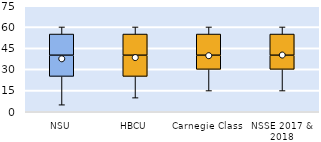
| Category | 25th | 50th | 75th |
|---|---|---|---|
| NSU | 25 | 15 | 15 |
| HBCU | 25 | 15 | 15 |
| Carnegie Class | 30 | 10 | 15 |
| NSSE 2017 & 2018 | 30 | 10 | 15 |